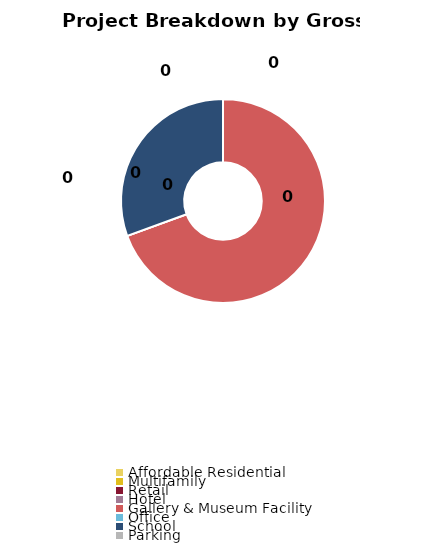
| Category | Series 0 |
|---|---|
| Affordable Residential | 0.007 |
| Multifamily | 0.009 |
| Retail | 0 |
| Hotel | 0.001 |
| Gallery & Museum Facility | 383346 |
| Office | 0 |
| School | 168628.8 |
| Parking | 0 |